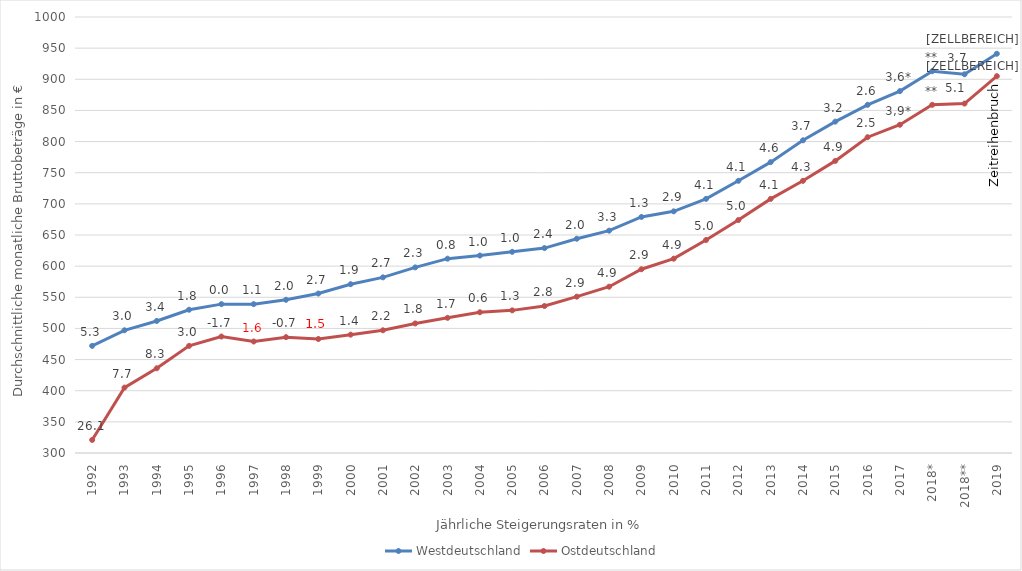
| Category | Westdeutschland | Ostdeutschland |
|---|---|---|
| 1992 | 472 | 321 |
| 1993 | 497 | 405 |
| 1994 | 512 | 436 |
| 1995 | 530 | 472 |
| 1996 | 539 | 487 |
| 1997 | 539 | 479 |
| 1998 | 546 | 486 |
| 1999 | 556 | 483 |
| 2000 | 571 | 490 |
| 2001 | 582 | 497 |
| 2002 | 598 | 508 |
| 2003 | 612 | 517 |
| 2004 | 617 | 526 |
| 2005 | 623 | 529 |
| 2006 | 629 | 536 |
| 2007 | 644 | 551 |
| 2008 | 657 | 567 |
| 2009 | 679 | 595 |
| 2010 | 688 | 612 |
| 2011 | 708 | 642 |
| 2012 | 737 | 674 |
| 2013 | 767 | 708 |
| 2014 | 802 | 737 |
| 2015 | 832 | 769 |
| 2016 | 859 | 807 |
| 2017 | 881 | 827 |
| 2018* | 913 | 859 |
| 2018** | 908 | 861 |
| 2019 | 941 | 905 |